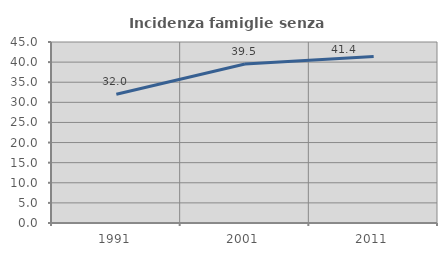
| Category | Incidenza famiglie senza nuclei |
|---|---|
| 1991.0 | 32.026 |
| 2001.0 | 39.512 |
| 2011.0 | 41.37 |